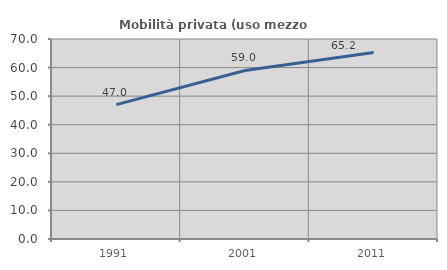
| Category | Mobilità privata (uso mezzo privato) |
|---|---|
| 1991.0 | 47.021 |
| 2001.0 | 58.989 |
| 2011.0 | 65.242 |